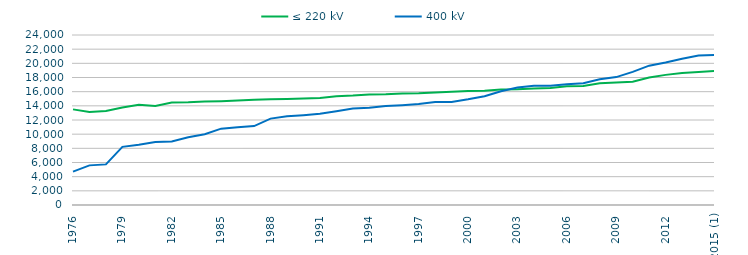
| Category | ≤ 220 kV | 400 kV |
|---|---|---|
| 1976 | 13501 | 4715 |
| 1977 | 13138 | 5595 |
| 1978 | 13258 | 5732 |
| 1979 | 13767 | 8207 |
| 1980 | 14139 | 8518 |
| 1981 | 13973 | 8906 |
| 1982 | 14466 | 8975 |
| 1983 | 14491 | 9563 |
| 1984 | 14598.3 | 9998 |
| 1985 | 14652.3 | 10781 |
| 1986 | 14746.3 | 10978 |
| 1987 | 14849.3 | 11147 |
| 1988 | 14938.3 | 12194 |
| 1989 | 14964.3 | 12533 |
| 1990 | 15034.5 | 12686 |
| 1991 | 15108.94 | 12883 |
| 1992 | 15356.14 | 13222 |
| 1993 | 15441.94 | 13611.17 |
| 1994 | 15585.94 | 13737.17 |
| 1995 | 15628.94 | 13969.73 |
| 1996 | 15733.54 | 14083.63 |
| 1997 | 15776.14 | 14243.65 |
| 1998 | 15875.92 | 14538.47 |
| 1999 | 15974.92 | 14538.47 |
| 2000 | 16077.74 | 14918 |
| 2001 | 16121.467 | 15364.269 |
| 2002 | 16296.158 | 16066.739 |
| 2003 | 16344.268 | 16592.459 |
| 2004 | 16464.172 | 16840.612 |
| 2005 | 16529.9 | 16845.694 |
| 2006 | 16752.829 | 17051.943 |
| 2007 | 16817.033 | 17190.606 |
| 2008 | 17174.804 | 17764.621 |
| 2009 | 17307.192 | 18056.021 |
| 2010 | 17400.504 | 18792.423 |
| 2011 | 18000.768 | 19671.35 |
| 2012 | 18369.641 | 20108.846 |
| 2013 | 18642.941 | 20639.478 |
| 2014 | 18782.059 | 21093.512 |
| 2015 (1) | 18924.164 | 21178.698 |